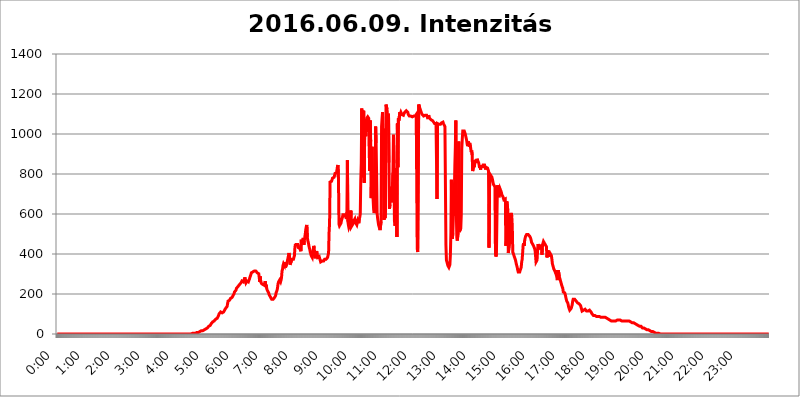
| Category | 2016.06.09. Intenzitás [W/m^2] |
|---|---|
| 0.0 | 0 |
| 0.0006944444444444445 | 0 |
| 0.001388888888888889 | 0 |
| 0.0020833333333333333 | 0 |
| 0.002777777777777778 | 0 |
| 0.003472222222222222 | 0 |
| 0.004166666666666667 | 0 |
| 0.004861111111111111 | 0 |
| 0.005555555555555556 | 0 |
| 0.0062499999999999995 | 0 |
| 0.006944444444444444 | 0 |
| 0.007638888888888889 | 0 |
| 0.008333333333333333 | 0 |
| 0.009027777777777779 | 0 |
| 0.009722222222222222 | 0 |
| 0.010416666666666666 | 0 |
| 0.011111111111111112 | 0 |
| 0.011805555555555555 | 0 |
| 0.012499999999999999 | 0 |
| 0.013194444444444444 | 0 |
| 0.013888888888888888 | 0 |
| 0.014583333333333332 | 0 |
| 0.015277777777777777 | 0 |
| 0.015972222222222224 | 0 |
| 0.016666666666666666 | 0 |
| 0.017361111111111112 | 0 |
| 0.018055555555555557 | 0 |
| 0.01875 | 0 |
| 0.019444444444444445 | 0 |
| 0.02013888888888889 | 0 |
| 0.020833333333333332 | 0 |
| 0.02152777777777778 | 0 |
| 0.022222222222222223 | 0 |
| 0.02291666666666667 | 0 |
| 0.02361111111111111 | 0 |
| 0.024305555555555556 | 0 |
| 0.024999999999999998 | 0 |
| 0.025694444444444447 | 0 |
| 0.02638888888888889 | 0 |
| 0.027083333333333334 | 0 |
| 0.027777777777777776 | 0 |
| 0.02847222222222222 | 0 |
| 0.029166666666666664 | 0 |
| 0.029861111111111113 | 0 |
| 0.030555555555555555 | 0 |
| 0.03125 | 0 |
| 0.03194444444444445 | 0 |
| 0.03263888888888889 | 0 |
| 0.03333333333333333 | 0 |
| 0.034027777777777775 | 0 |
| 0.034722222222222224 | 0 |
| 0.035416666666666666 | 0 |
| 0.036111111111111115 | 0 |
| 0.03680555555555556 | 0 |
| 0.0375 | 0 |
| 0.03819444444444444 | 0 |
| 0.03888888888888889 | 0 |
| 0.03958333333333333 | 0 |
| 0.04027777777777778 | 0 |
| 0.04097222222222222 | 0 |
| 0.041666666666666664 | 0 |
| 0.042361111111111106 | 0 |
| 0.04305555555555556 | 0 |
| 0.043750000000000004 | 0 |
| 0.044444444444444446 | 0 |
| 0.04513888888888889 | 0 |
| 0.04583333333333334 | 0 |
| 0.04652777777777778 | 0 |
| 0.04722222222222222 | 0 |
| 0.04791666666666666 | 0 |
| 0.04861111111111111 | 0 |
| 0.049305555555555554 | 0 |
| 0.049999999999999996 | 0 |
| 0.05069444444444445 | 0 |
| 0.051388888888888894 | 0 |
| 0.052083333333333336 | 0 |
| 0.05277777777777778 | 0 |
| 0.05347222222222222 | 0 |
| 0.05416666666666667 | 0 |
| 0.05486111111111111 | 0 |
| 0.05555555555555555 | 0 |
| 0.05625 | 0 |
| 0.05694444444444444 | 0 |
| 0.057638888888888885 | 0 |
| 0.05833333333333333 | 0 |
| 0.05902777777777778 | 0 |
| 0.059722222222222225 | 0 |
| 0.06041666666666667 | 0 |
| 0.061111111111111116 | 0 |
| 0.06180555555555556 | 0 |
| 0.0625 | 0 |
| 0.06319444444444444 | 0 |
| 0.06388888888888888 | 0 |
| 0.06458333333333334 | 0 |
| 0.06527777777777778 | 0 |
| 0.06597222222222222 | 0 |
| 0.06666666666666667 | 0 |
| 0.06736111111111111 | 0 |
| 0.06805555555555555 | 0 |
| 0.06874999999999999 | 0 |
| 0.06944444444444443 | 0 |
| 0.07013888888888889 | 0 |
| 0.07083333333333333 | 0 |
| 0.07152777777777779 | 0 |
| 0.07222222222222223 | 0 |
| 0.07291666666666667 | 0 |
| 0.07361111111111111 | 0 |
| 0.07430555555555556 | 0 |
| 0.075 | 0 |
| 0.07569444444444444 | 0 |
| 0.0763888888888889 | 0 |
| 0.07708333333333334 | 0 |
| 0.07777777777777778 | 0 |
| 0.07847222222222222 | 0 |
| 0.07916666666666666 | 0 |
| 0.0798611111111111 | 0 |
| 0.08055555555555556 | 0 |
| 0.08125 | 0 |
| 0.08194444444444444 | 0 |
| 0.08263888888888889 | 0 |
| 0.08333333333333333 | 0 |
| 0.08402777777777777 | 0 |
| 0.08472222222222221 | 0 |
| 0.08541666666666665 | 0 |
| 0.08611111111111112 | 0 |
| 0.08680555555555557 | 0 |
| 0.08750000000000001 | 0 |
| 0.08819444444444445 | 0 |
| 0.08888888888888889 | 0 |
| 0.08958333333333333 | 0 |
| 0.09027777777777778 | 0 |
| 0.09097222222222222 | 0 |
| 0.09166666666666667 | 0 |
| 0.09236111111111112 | 0 |
| 0.09305555555555556 | 0 |
| 0.09375 | 0 |
| 0.09444444444444444 | 0 |
| 0.09513888888888888 | 0 |
| 0.09583333333333333 | 0 |
| 0.09652777777777777 | 0 |
| 0.09722222222222222 | 0 |
| 0.09791666666666667 | 0 |
| 0.09861111111111111 | 0 |
| 0.09930555555555555 | 0 |
| 0.09999999999999999 | 0 |
| 0.10069444444444443 | 0 |
| 0.1013888888888889 | 0 |
| 0.10208333333333335 | 0 |
| 0.10277777777777779 | 0 |
| 0.10347222222222223 | 0 |
| 0.10416666666666667 | 0 |
| 0.10486111111111111 | 0 |
| 0.10555555555555556 | 0 |
| 0.10625 | 0 |
| 0.10694444444444444 | 0 |
| 0.1076388888888889 | 0 |
| 0.10833333333333334 | 0 |
| 0.10902777777777778 | 0 |
| 0.10972222222222222 | 0 |
| 0.1111111111111111 | 0 |
| 0.11180555555555556 | 0 |
| 0.11180555555555556 | 0 |
| 0.1125 | 0 |
| 0.11319444444444444 | 0 |
| 0.11388888888888889 | 0 |
| 0.11458333333333333 | 0 |
| 0.11527777777777777 | 0 |
| 0.11597222222222221 | 0 |
| 0.11666666666666665 | 0 |
| 0.1173611111111111 | 0 |
| 0.11805555555555557 | 0 |
| 0.11944444444444445 | 0 |
| 0.12013888888888889 | 0 |
| 0.12083333333333333 | 0 |
| 0.12152777777777778 | 0 |
| 0.12222222222222223 | 0 |
| 0.12291666666666667 | 0 |
| 0.12291666666666667 | 0 |
| 0.12361111111111112 | 0 |
| 0.12430555555555556 | 0 |
| 0.125 | 0 |
| 0.12569444444444444 | 0 |
| 0.12638888888888888 | 0 |
| 0.12708333333333333 | 0 |
| 0.16875 | 0 |
| 0.12847222222222224 | 0 |
| 0.12916666666666668 | 0 |
| 0.12986111111111112 | 0 |
| 0.13055555555555556 | 0 |
| 0.13125 | 0 |
| 0.13194444444444445 | 0 |
| 0.1326388888888889 | 0 |
| 0.13333333333333333 | 0 |
| 0.13402777777777777 | 0 |
| 0.13402777777777777 | 0 |
| 0.13472222222222222 | 0 |
| 0.13541666666666666 | 0 |
| 0.1361111111111111 | 0 |
| 0.13749999999999998 | 0 |
| 0.13819444444444443 | 0 |
| 0.1388888888888889 | 0 |
| 0.13958333333333334 | 0 |
| 0.14027777777777778 | 0 |
| 0.14097222222222222 | 0 |
| 0.14166666666666666 | 0 |
| 0.1423611111111111 | 0 |
| 0.14305555555555557 | 0 |
| 0.14375000000000002 | 0 |
| 0.14444444444444446 | 0 |
| 0.1451388888888889 | 0 |
| 0.1451388888888889 | 0 |
| 0.14652777777777778 | 0 |
| 0.14722222222222223 | 0 |
| 0.14791666666666667 | 0 |
| 0.1486111111111111 | 0 |
| 0.14930555555555555 | 0 |
| 0.15 | 0 |
| 0.15069444444444444 | 0 |
| 0.15138888888888888 | 0 |
| 0.15208333333333332 | 0 |
| 0.15277777777777776 | 0 |
| 0.15347222222222223 | 0 |
| 0.15416666666666667 | 0 |
| 0.15486111111111112 | 0 |
| 0.15555555555555556 | 0 |
| 0.15625 | 0 |
| 0.15694444444444444 | 0 |
| 0.15763888888888888 | 0 |
| 0.15833333333333333 | 0 |
| 0.15902777777777777 | 0 |
| 0.15972222222222224 | 0 |
| 0.16041666666666668 | 0 |
| 0.16111111111111112 | 0 |
| 0.16180555555555556 | 0 |
| 0.1625 | 0 |
| 0.16319444444444445 | 0 |
| 0.1638888888888889 | 0 |
| 0.16458333333333333 | 0 |
| 0.16527777777777777 | 0 |
| 0.16597222222222222 | 0 |
| 0.16666666666666666 | 0 |
| 0.1673611111111111 | 0 |
| 0.16805555555555554 | 0 |
| 0.16874999999999998 | 0 |
| 0.16944444444444443 | 0 |
| 0.17013888888888887 | 0 |
| 0.1708333333333333 | 0 |
| 0.17152777777777775 | 0 |
| 0.17222222222222225 | 0 |
| 0.1729166666666667 | 0 |
| 0.17361111111111113 | 0 |
| 0.17430555555555557 | 0 |
| 0.17500000000000002 | 0 |
| 0.17569444444444446 | 0 |
| 0.1763888888888889 | 0 |
| 0.17708333333333334 | 0 |
| 0.17777777777777778 | 0 |
| 0.17847222222222223 | 0 |
| 0.17916666666666667 | 0 |
| 0.1798611111111111 | 0 |
| 0.18055555555555555 | 0 |
| 0.18125 | 0 |
| 0.18194444444444444 | 0 |
| 0.1826388888888889 | 0 |
| 0.18333333333333335 | 0 |
| 0.1840277777777778 | 0 |
| 0.18472222222222223 | 0 |
| 0.18541666666666667 | 0 |
| 0.18611111111111112 | 0 |
| 0.18680555555555556 | 3.525 |
| 0.1875 | 0 |
| 0.18819444444444444 | 0 |
| 0.18888888888888888 | 3.525 |
| 0.18958333333333333 | 3.525 |
| 0.19027777777777777 | 3.525 |
| 0.1909722222222222 | 3.525 |
| 0.19166666666666665 | 3.525 |
| 0.19236111111111112 | 3.525 |
| 0.19305555555555554 | 3.525 |
| 0.19375 | 3.525 |
| 0.19444444444444445 | 3.525 |
| 0.1951388888888889 | 3.525 |
| 0.19583333333333333 | 7.887 |
| 0.19652777777777777 | 7.887 |
| 0.19722222222222222 | 7.887 |
| 0.19791666666666666 | 7.887 |
| 0.1986111111111111 | 12.257 |
| 0.19930555555555554 | 12.257 |
| 0.19999999999999998 | 12.257 |
| 0.20069444444444443 | 12.257 |
| 0.20138888888888887 | 12.257 |
| 0.2020833333333333 | 16.636 |
| 0.2027777777777778 | 16.636 |
| 0.2034722222222222 | 16.636 |
| 0.2041666666666667 | 16.636 |
| 0.20486111111111113 | 16.636 |
| 0.20555555555555557 | 21.024 |
| 0.20625000000000002 | 21.024 |
| 0.20694444444444446 | 21.024 |
| 0.2076388888888889 | 25.419 |
| 0.20833333333333334 | 25.419 |
| 0.20902777777777778 | 25.419 |
| 0.20972222222222223 | 29.823 |
| 0.21041666666666667 | 29.823 |
| 0.2111111111111111 | 29.823 |
| 0.21180555555555555 | 34.234 |
| 0.2125 | 38.653 |
| 0.21319444444444444 | 38.653 |
| 0.2138888888888889 | 43.079 |
| 0.21458333333333335 | 43.079 |
| 0.2152777777777778 | 47.511 |
| 0.21597222222222223 | 51.951 |
| 0.21666666666666667 | 56.398 |
| 0.21736111111111112 | 56.398 |
| 0.21805555555555556 | 60.85 |
| 0.21875 | 60.85 |
| 0.21944444444444444 | 65.31 |
| 0.22013888888888888 | 65.31 |
| 0.22083333333333333 | 69.775 |
| 0.22152777777777777 | 69.775 |
| 0.2222222222222222 | 74.246 |
| 0.22291666666666665 | 74.246 |
| 0.2236111111111111 | 78.722 |
| 0.22430555555555556 | 78.722 |
| 0.225 | 83.205 |
| 0.22569444444444445 | 87.692 |
| 0.2263888888888889 | 92.184 |
| 0.22708333333333333 | 101.184 |
| 0.22777777777777777 | 101.184 |
| 0.22847222222222222 | 105.69 |
| 0.22916666666666666 | 110.201 |
| 0.2298611111111111 | 110.201 |
| 0.23055555555555554 | 105.69 |
| 0.23124999999999998 | 105.69 |
| 0.23194444444444443 | 105.69 |
| 0.23263888888888887 | 105.69 |
| 0.2333333333333333 | 110.201 |
| 0.2340277777777778 | 110.201 |
| 0.2347222222222222 | 119.235 |
| 0.2354166666666667 | 123.758 |
| 0.23611111111111113 | 128.284 |
| 0.23680555555555557 | 132.814 |
| 0.23750000000000002 | 132.814 |
| 0.23819444444444446 | 137.347 |
| 0.2388888888888889 | 141.884 |
| 0.23958333333333334 | 164.605 |
| 0.24027777777777778 | 169.156 |
| 0.24097222222222223 | 169.156 |
| 0.24166666666666667 | 169.156 |
| 0.2423611111111111 | 173.709 |
| 0.24305555555555555 | 178.264 |
| 0.24375 | 178.264 |
| 0.24444444444444446 | 182.82 |
| 0.24513888888888888 | 182.82 |
| 0.24583333333333335 | 187.378 |
| 0.2465277777777778 | 191.937 |
| 0.24722222222222223 | 191.937 |
| 0.24791666666666667 | 201.058 |
| 0.24861111111111112 | 210.182 |
| 0.24930555555555556 | 214.746 |
| 0.25 | 214.746 |
| 0.25069444444444444 | 219.309 |
| 0.2513888888888889 | 228.436 |
| 0.2520833333333333 | 233 |
| 0.25277777777777777 | 233 |
| 0.2534722222222222 | 237.564 |
| 0.25416666666666665 | 242.127 |
| 0.2548611111111111 | 242.127 |
| 0.2555555555555556 | 246.689 |
| 0.25625000000000003 | 251.251 |
| 0.2569444444444445 | 251.251 |
| 0.2576388888888889 | 255.813 |
| 0.25833333333333336 | 260.373 |
| 0.2590277777777778 | 264.932 |
| 0.25972222222222224 | 264.932 |
| 0.2604166666666667 | 260.373 |
| 0.2611111111111111 | 260.373 |
| 0.26180555555555557 | 260.373 |
| 0.2625 | 255.813 |
| 0.26319444444444445 | 283.156 |
| 0.2638888888888889 | 264.932 |
| 0.26458333333333334 | 255.813 |
| 0.2652777777777778 | 255.813 |
| 0.2659722222222222 | 264.932 |
| 0.26666666666666666 | 260.373 |
| 0.2673611111111111 | 260.373 |
| 0.26805555555555555 | 260.373 |
| 0.26875 | 264.932 |
| 0.26944444444444443 | 274.047 |
| 0.2701388888888889 | 269.49 |
| 0.2708333333333333 | 269.49 |
| 0.27152777777777776 | 296.808 |
| 0.2722222222222222 | 305.898 |
| 0.27291666666666664 | 301.354 |
| 0.2736111111111111 | 305.898 |
| 0.2743055555555555 | 310.44 |
| 0.27499999999999997 | 314.98 |
| 0.27569444444444446 | 314.98 |
| 0.27638888888888885 | 314.98 |
| 0.27708333333333335 | 314.98 |
| 0.2777777777777778 | 314.98 |
| 0.27847222222222223 | 314.98 |
| 0.2791666666666667 | 314.98 |
| 0.2798611111111111 | 310.44 |
| 0.28055555555555556 | 305.898 |
| 0.28125 | 301.354 |
| 0.28194444444444444 | 301.354 |
| 0.2826388888888889 | 301.354 |
| 0.2833333333333333 | 296.808 |
| 0.28402777777777777 | 260.373 |
| 0.2847222222222222 | 287.709 |
| 0.28541666666666665 | 260.373 |
| 0.28611111111111115 | 260.373 |
| 0.28680555555555554 | 251.251 |
| 0.28750000000000003 | 251.251 |
| 0.2881944444444445 | 251.251 |
| 0.2888888888888889 | 246.689 |
| 0.28958333333333336 | 242.127 |
| 0.2902777777777778 | 242.127 |
| 0.29097222222222224 | 242.127 |
| 0.2916666666666667 | 264.932 |
| 0.2923611111111111 | 237.564 |
| 0.29305555555555557 | 246.689 |
| 0.29375 | 228.436 |
| 0.29444444444444445 | 219.309 |
| 0.2951388888888889 | 219.309 |
| 0.29583333333333334 | 214.746 |
| 0.2965277777777778 | 205.62 |
| 0.2972222222222222 | 196.497 |
| 0.29791666666666666 | 191.937 |
| 0.2986111111111111 | 187.378 |
| 0.29930555555555555 | 182.82 |
| 0.3 | 182.82 |
| 0.30069444444444443 | 173.709 |
| 0.3013888888888889 | 173.709 |
| 0.3020833333333333 | 173.709 |
| 0.30277777777777776 | 173.709 |
| 0.3034722222222222 | 178.264 |
| 0.30416666666666664 | 178.264 |
| 0.3048611111111111 | 182.82 |
| 0.3055555555555555 | 187.378 |
| 0.30624999999999997 | 191.937 |
| 0.3069444444444444 | 205.62 |
| 0.3076388888888889 | 210.182 |
| 0.30833333333333335 | 219.309 |
| 0.3090277777777778 | 233 |
| 0.30972222222222223 | 251.251 |
| 0.3104166666666667 | 260.373 |
| 0.3111111111111111 | 260.373 |
| 0.31180555555555556 | 269.49 |
| 0.3125 | 269.49 |
| 0.31319444444444444 | 260.373 |
| 0.3138888888888889 | 269.49 |
| 0.3145833333333333 | 283.156 |
| 0.31527777777777777 | 314.98 |
| 0.3159722222222222 | 324.052 |
| 0.31666666666666665 | 342.162 |
| 0.31736111111111115 | 351.198 |
| 0.31805555555555554 | 355.712 |
| 0.31875000000000003 | 342.162 |
| 0.3194444444444445 | 360.221 |
| 0.3201388888888889 | 333.113 |
| 0.32083333333333336 | 337.639 |
| 0.3215277777777778 | 346.682 |
| 0.32222222222222224 | 355.712 |
| 0.3229166666666667 | 351.198 |
| 0.3236111111111111 | 360.221 |
| 0.32430555555555557 | 391.685 |
| 0.325 | 405.108 |
| 0.32569444444444445 | 387.202 |
| 0.3263888888888889 | 346.682 |
| 0.32708333333333334 | 342.162 |
| 0.3277777777777778 | 351.198 |
| 0.3284722222222222 | 364.728 |
| 0.32916666666666666 | 373.729 |
| 0.3298611111111111 | 378.224 |
| 0.33055555555555555 | 373.729 |
| 0.33125 | 373.729 |
| 0.33194444444444443 | 378.224 |
| 0.3326388888888889 | 391.685 |
| 0.3333333333333333 | 431.833 |
| 0.3340277777777778 | 449.551 |
| 0.3347222222222222 | 440.702 |
| 0.3354166666666667 | 453.968 |
| 0.3361111111111111 | 440.702 |
| 0.3368055555555556 | 453.968 |
| 0.33749999999999997 | 458.38 |
| 0.33819444444444446 | 431.833 |
| 0.33888888888888885 | 431.833 |
| 0.33958333333333335 | 431.833 |
| 0.34027777777777773 | 427.39 |
| 0.34097222222222223 | 422.943 |
| 0.3416666666666666 | 414.035 |
| 0.3423611111111111 | 471.582 |
| 0.3430555555555555 | 458.38 |
| 0.34375 | 458.38 |
| 0.3444444444444445 | 471.582 |
| 0.3451388888888889 | 480.356 |
| 0.3458333333333334 | 445.129 |
| 0.34652777777777777 | 467.187 |
| 0.34722222222222227 | 471.582 |
| 0.34791666666666665 | 502.192 |
| 0.34861111111111115 | 523.88 |
| 0.34930555555555554 | 536.82 |
| 0.35000000000000003 | 545.416 |
| 0.3506944444444444 | 484.735 |
| 0.3513888888888889 | 467.187 |
| 0.3520833333333333 | 458.38 |
| 0.3527777777777778 | 445.129 |
| 0.3534722222222222 | 431.833 |
| 0.3541666666666667 | 422.943 |
| 0.3548611111111111 | 409.574 |
| 0.35555555555555557 | 400.638 |
| 0.35625 | 391.685 |
| 0.35694444444444445 | 387.202 |
| 0.3576388888888889 | 382.715 |
| 0.35833333333333334 | 378.224 |
| 0.3590277777777778 | 382.715 |
| 0.3597222222222222 | 440.702 |
| 0.36041666666666666 | 431.833 |
| 0.3611111111111111 | 391.685 |
| 0.36180555555555555 | 378.224 |
| 0.3625 | 414.035 |
| 0.36319444444444443 | 405.108 |
| 0.3638888888888889 | 414.035 |
| 0.3645833333333333 | 396.164 |
| 0.3652777777777778 | 382.715 |
| 0.3659722222222222 | 387.202 |
| 0.3666666666666667 | 387.202 |
| 0.3673611111111111 | 387.202 |
| 0.3680555555555556 | 378.224 |
| 0.36874999999999997 | 369.23 |
| 0.36944444444444446 | 360.221 |
| 0.37013888888888885 | 360.221 |
| 0.37083333333333335 | 364.728 |
| 0.37152777777777773 | 364.728 |
| 0.37222222222222223 | 369.23 |
| 0.3729166666666666 | 364.728 |
| 0.3736111111111111 | 364.728 |
| 0.3743055555555555 | 369.23 |
| 0.375 | 373.729 |
| 0.3756944444444445 | 373.729 |
| 0.3763888888888889 | 369.23 |
| 0.3770833333333334 | 373.729 |
| 0.37777777777777777 | 369.23 |
| 0.37847222222222227 | 373.729 |
| 0.37916666666666665 | 382.715 |
| 0.37986111111111115 | 387.202 |
| 0.38055555555555554 | 405.108 |
| 0.38125000000000003 | 506.542 |
| 0.3819444444444444 | 553.986 |
| 0.3826388888888889 | 759.723 |
| 0.3833333333333333 | 759.723 |
| 0.3840277777777778 | 759.723 |
| 0.3847222222222222 | 763.674 |
| 0.3854166666666667 | 771.559 |
| 0.3861111111111111 | 779.42 |
| 0.38680555555555557 | 783.342 |
| 0.3875 | 779.42 |
| 0.38819444444444445 | 783.342 |
| 0.3888888888888889 | 791.169 |
| 0.38958333333333334 | 802.868 |
| 0.3902777777777778 | 802.868 |
| 0.3909722222222222 | 806.757 |
| 0.39166666666666666 | 806.757 |
| 0.3923611111111111 | 822.26 |
| 0.39305555555555555 | 837.682 |
| 0.39375 | 845.365 |
| 0.39444444444444443 | 767.62 |
| 0.3951388888888889 | 549.704 |
| 0.3958333333333333 | 541.121 |
| 0.3965277777777778 | 541.121 |
| 0.3972222222222222 | 541.121 |
| 0.3979166666666667 | 553.986 |
| 0.3986111111111111 | 566.793 |
| 0.3993055555555556 | 575.299 |
| 0.39999999999999997 | 583.779 |
| 0.40069444444444446 | 596.45 |
| 0.40138888888888885 | 600.661 |
| 0.40208333333333335 | 600.661 |
| 0.40277777777777773 | 596.45 |
| 0.40347222222222223 | 596.45 |
| 0.4041666666666666 | 592.233 |
| 0.4048611111111111 | 583.779 |
| 0.4055555555555555 | 575.299 |
| 0.40625 | 609.062 |
| 0.4069444444444445 | 868.305 |
| 0.4076388888888889 | 562.53 |
| 0.4083333333333334 | 545.416 |
| 0.40902777777777777 | 532.513 |
| 0.40972222222222227 | 532.513 |
| 0.41041666666666665 | 545.416 |
| 0.41111111111111115 | 558.261 |
| 0.41180555555555554 | 617.436 |
| 0.41250000000000003 | 536.82 |
| 0.4131944444444444 | 536.82 |
| 0.4138888888888889 | 541.121 |
| 0.4145833333333333 | 549.704 |
| 0.4152777777777778 | 553.986 |
| 0.4159722222222222 | 566.793 |
| 0.4166666666666667 | 571.049 |
| 0.4173611111111111 | 575.299 |
| 0.41805555555555557 | 562.53 |
| 0.41875 | 553.986 |
| 0.41944444444444445 | 549.704 |
| 0.4201388888888889 | 545.416 |
| 0.42083333333333334 | 541.121 |
| 0.4215277777777778 | 566.793 |
| 0.4222222222222222 | 566.793 |
| 0.42291666666666666 | 553.986 |
| 0.4236111111111111 | 575.299 |
| 0.42430555555555555 | 583.779 |
| 0.425 | 600.661 |
| 0.42569444444444443 | 767.62 |
| 0.4263888888888889 | 853.029 |
| 0.4270833333333333 | 1127.879 |
| 0.4277777777777778 | 783.342 |
| 0.4284722222222222 | 1116.426 |
| 0.4291666666666667 | 1108.816 |
| 0.4298611111111111 | 1116.426 |
| 0.4305555555555556 | 755.766 |
| 0.43124999999999997 | 1052.255 |
| 0.43194444444444446 | 1018.587 |
| 0.43263888888888885 | 988.714 |
| 0.43333333333333335 | 1056.004 |
| 0.43402777777777773 | 1078.555 |
| 0.43472222222222223 | 1082.324 |
| 0.4354166666666666 | 1086.097 |
| 0.4361111111111111 | 1086.097 |
| 0.4368055555555555 | 1078.555 |
| 0.4375 | 921.298 |
| 0.4381944444444445 | 814.519 |
| 0.4388888888888889 | 1067.267 |
| 0.4395833333333334 | 962.555 |
| 0.44027777777777777 | 679.395 |
| 0.44097222222222227 | 806.757 |
| 0.44166666666666665 | 936.33 |
| 0.44236111111111115 | 719.877 |
| 0.44305555555555554 | 723.889 |
| 0.44375000000000003 | 621.613 |
| 0.4444444444444444 | 604.864 |
| 0.4451388888888889 | 613.252 |
| 0.4458333333333333 | 650.667 |
| 0.4465277777777778 | 1037.277 |
| 0.4472222222222222 | 955.071 |
| 0.4479166666666667 | 798.974 |
| 0.4486111111111111 | 604.864 |
| 0.44930555555555557 | 579.542 |
| 0.45 | 562.53 |
| 0.45069444444444445 | 545.416 |
| 0.4513888888888889 | 536.82 |
| 0.45208333333333334 | 528.2 |
| 0.4527777777777778 | 519.555 |
| 0.4534722222222222 | 523.88 |
| 0.45416666666666666 | 562.53 |
| 0.4548611111111111 | 1037.277 |
| 0.45555555555555555 | 1078.555 |
| 0.45625 | 1108.816 |
| 0.45694444444444443 | 860.676 |
| 0.4576388888888889 | 1026.06 |
| 0.4583333333333333 | 571.049 |
| 0.4590277777777778 | 604.864 |
| 0.4597222222222222 | 579.542 |
| 0.4604166666666667 | 621.613 |
| 0.4611111111111111 | 1147.086 |
| 0.4618055555555556 | 1147.086 |
| 0.46249999999999997 | 1124.056 |
| 0.46319444444444446 | 1093.653 |
| 0.46388888888888885 | 1059.756 |
| 0.46458333333333335 | 1101.226 |
| 0.46527777777777773 | 856.855 |
| 0.46597222222222223 | 625.784 |
| 0.4666666666666666 | 646.537 |
| 0.4673611111111111 | 687.544 |
| 0.4680555555555555 | 723.889 |
| 0.46875 | 735.89 |
| 0.4694444444444445 | 658.909 |
| 0.4701388888888889 | 658.909 |
| 0.4708333333333334 | 806.757 |
| 0.47152777777777777 | 996.182 |
| 0.47222222222222227 | 853.029 |
| 0.47291666666666665 | 566.793 |
| 0.47361111111111115 | 541.121 |
| 0.47430555555555554 | 549.704 |
| 0.47500000000000003 | 600.661 |
| 0.4756944444444444 | 829.981 |
| 0.4763888888888889 | 484.735 |
| 0.4770833333333333 | 1052.255 |
| 0.4777777777777778 | 833.834 |
| 0.4784722222222222 | 1078.555 |
| 0.4791666666666667 | 1067.267 |
| 0.4798611111111111 | 1067.267 |
| 0.48055555555555557 | 1108.816 |
| 0.48125 | 1101.226 |
| 0.48194444444444445 | 1108.816 |
| 0.4826388888888889 | 1105.019 |
| 0.48333333333333334 | 1097.437 |
| 0.4840277777777778 | 1093.653 |
| 0.4847222222222222 | 1093.653 |
| 0.48541666666666666 | 1093.653 |
| 0.4861111111111111 | 1101.226 |
| 0.48680555555555555 | 1105.019 |
| 0.4875 | 1108.816 |
| 0.48819444444444443 | 1112.618 |
| 0.4888888888888889 | 1108.816 |
| 0.4895833333333333 | 1116.426 |
| 0.4902777777777778 | 1116.426 |
| 0.4909722222222222 | 1116.426 |
| 0.4916666666666667 | 1108.816 |
| 0.4923611111111111 | 1097.437 |
| 0.4930555555555556 | 1097.437 |
| 0.49374999999999997 | 1089.873 |
| 0.49444444444444446 | 1089.873 |
| 0.49513888888888885 | 1089.873 |
| 0.49583333333333335 | 1089.873 |
| 0.49652777777777773 | 1086.097 |
| 0.49722222222222223 | 1086.097 |
| 0.4979166666666666 | 1086.097 |
| 0.4986111111111111 | 1086.097 |
| 0.4993055555555555 | 1089.873 |
| 0.5 | 1089.873 |
| 0.5006944444444444 | 1086.097 |
| 0.5013888888888889 | 1086.097 |
| 0.5020833333333333 | 1089.873 |
| 0.5027777777777778 | 1093.653 |
| 0.5034722222222222 | 1097.437 |
| 0.5041666666666667 | 1101.226 |
| 0.5048611111111111 | 427.39 |
| 0.5055555555555555 | 409.574 |
| 0.50625 | 414.035 |
| 0.5069444444444444 | 1147.086 |
| 0.5076388888888889 | 1147.086 |
| 0.5083333333333333 | 1131.708 |
| 0.5090277777777777 | 1127.879 |
| 0.5097222222222222 | 1116.426 |
| 0.5104166666666666 | 1108.816 |
| 0.5111111111111112 | 1108.816 |
| 0.5118055555555555 | 1097.437 |
| 0.5125000000000001 | 1097.437 |
| 0.5131944444444444 | 1093.653 |
| 0.513888888888889 | 1089.873 |
| 0.5145833333333333 | 1093.653 |
| 0.5152777777777778 | 1089.873 |
| 0.5159722222222222 | 1093.653 |
| 0.5166666666666667 | 1093.653 |
| 0.517361111111111 | 1093.653 |
| 0.5180555555555556 | 1093.653 |
| 0.5187499999999999 | 1097.437 |
| 0.5194444444444445 | 1093.653 |
| 0.5201388888888888 | 1074.789 |
| 0.5208333333333334 | 1093.653 |
| 0.5215277777777778 | 1086.097 |
| 0.5222222222222223 | 1078.555 |
| 0.5229166666666667 | 1074.789 |
| 0.5236111111111111 | 1074.789 |
| 0.5243055555555556 | 1071.027 |
| 0.525 | 1071.027 |
| 0.5256944444444445 | 1074.789 |
| 0.5263888888888889 | 1067.267 |
| 0.5270833333333333 | 1063.51 |
| 0.5277777777777778 | 1059.756 |
| 0.5284722222222222 | 1056.004 |
| 0.5291666666666667 | 1052.255 |
| 0.5298611111111111 | 1048.508 |
| 0.5305555555555556 | 1052.255 |
| 0.53125 | 1052.255 |
| 0.5319444444444444 | 1048.508 |
| 0.5326388888888889 | 675.311 |
| 0.5333333333333333 | 1052.255 |
| 0.5340277777777778 | 1052.255 |
| 0.5347222222222222 | 1056.004 |
| 0.5354166666666667 | 1048.508 |
| 0.5361111111111111 | 1048.508 |
| 0.5368055555555555 | 1052.255 |
| 0.5375 | 1048.508 |
| 0.5381944444444444 | 1052.255 |
| 0.5388888888888889 | 1056.004 |
| 0.5395833333333333 | 1052.255 |
| 0.5402777777777777 | 1059.756 |
| 0.5409722222222222 | 1059.756 |
| 0.5416666666666666 | 1052.255 |
| 0.5423611111111112 | 1048.508 |
| 0.5430555555555555 | 1052.255 |
| 0.5437500000000001 | 1037.277 |
| 0.5444444444444444 | 1041.019 |
| 0.545138888888889 | 445.129 |
| 0.5458333333333333 | 369.23 |
| 0.5465277777777778 | 360.221 |
| 0.5472222222222222 | 351.198 |
| 0.5479166666666667 | 342.162 |
| 0.548611111111111 | 337.639 |
| 0.5493055555555556 | 333.113 |
| 0.5499999999999999 | 333.113 |
| 0.5506944444444445 | 346.682 |
| 0.5513888888888888 | 396.164 |
| 0.5520833333333334 | 506.542 |
| 0.5527777777777778 | 771.559 |
| 0.5534722222222223 | 489.108 |
| 0.5541666666666667 | 475.972 |
| 0.5548611111111111 | 506.542 |
| 0.5555555555555556 | 588.009 |
| 0.55625 | 604.864 |
| 0.5569444444444445 | 711.832 |
| 0.5576388888888889 | 841.526 |
| 0.5583333333333333 | 932.576 |
| 0.5590277777777778 | 1067.267 |
| 0.5597222222222222 | 609.062 |
| 0.5604166666666667 | 480.356 |
| 0.5611111111111111 | 467.187 |
| 0.5618055555555556 | 467.187 |
| 0.5625 | 519.555 |
| 0.5631944444444444 | 962.555 |
| 0.5638888888888889 | 510.885 |
| 0.5645833333333333 | 506.542 |
| 0.5652777777777778 | 506.542 |
| 0.5659722222222222 | 528.2 |
| 0.5666666666666667 | 596.45 |
| 0.5673611111111111 | 925.06 |
| 0.5680555555555555 | 973.772 |
| 0.56875 | 1014.852 |
| 0.5694444444444444 | 1014.852 |
| 0.5701388888888889 | 1014.852 |
| 0.5708333333333333 | 1014.852 |
| 0.5715277777777777 | 1014.852 |
| 0.5722222222222222 | 999.916 |
| 0.5729166666666666 | 999.916 |
| 0.5736111111111112 | 999.916 |
| 0.5743055555555555 | 966.295 |
| 0.5750000000000001 | 947.58 |
| 0.5756944444444444 | 940.082 |
| 0.576388888888889 | 962.555 |
| 0.5770833333333333 | 955.071 |
| 0.5777777777777778 | 936.33 |
| 0.5784722222222222 | 955.071 |
| 0.5791666666666667 | 955.071 |
| 0.579861111111111 | 928.819 |
| 0.5805555555555556 | 909.996 |
| 0.5812499999999999 | 917.534 |
| 0.5819444444444445 | 894.885 |
| 0.5826388888888888 | 814.519 |
| 0.5833333333333334 | 810.641 |
| 0.5840277777777778 | 841.526 |
| 0.5847222222222223 | 833.834 |
| 0.5854166666666667 | 868.305 |
| 0.5861111111111111 | 856.855 |
| 0.5868055555555556 | 864.493 |
| 0.5875 | 872.114 |
| 0.5881944444444445 | 856.855 |
| 0.5888888888888889 | 875.918 |
| 0.5895833333333333 | 868.305 |
| 0.5902777777777778 | 868.305 |
| 0.5909722222222222 | 856.855 |
| 0.5916666666666667 | 845.365 |
| 0.5923611111111111 | 829.981 |
| 0.5930555555555556 | 841.526 |
| 0.59375 | 822.26 |
| 0.5944444444444444 | 837.682 |
| 0.5951388888888889 | 837.682 |
| 0.5958333333333333 | 837.682 |
| 0.5965277777777778 | 837.682 |
| 0.5972222222222222 | 845.365 |
| 0.5979166666666667 | 841.526 |
| 0.5986111111111111 | 841.526 |
| 0.5993055555555555 | 845.365 |
| 0.6 | 845.365 |
| 0.6006944444444444 | 822.26 |
| 0.6013888888888889 | 833.834 |
| 0.6020833333333333 | 829.981 |
| 0.6027777777777777 | 829.981 |
| 0.6034722222222222 | 829.981 |
| 0.6041666666666666 | 833.834 |
| 0.6048611111111112 | 814.519 |
| 0.6055555555555555 | 431.833 |
| 0.6062500000000001 | 723.889 |
| 0.6069444444444444 | 783.342 |
| 0.607638888888889 | 795.074 |
| 0.6083333333333333 | 791.169 |
| 0.6090277777777778 | 791.169 |
| 0.6097222222222222 | 783.342 |
| 0.6104166666666667 | 779.42 |
| 0.611111111111111 | 759.723 |
| 0.6118055555555556 | 747.834 |
| 0.6124999999999999 | 743.859 |
| 0.6131944444444445 | 751.803 |
| 0.6138888888888888 | 735.89 |
| 0.6145833333333334 | 405.108 |
| 0.6152777777777778 | 387.202 |
| 0.6159722222222223 | 400.638 |
| 0.6166666666666667 | 583.779 |
| 0.6173611111111111 | 743.859 |
| 0.6180555555555556 | 743.859 |
| 0.61875 | 711.832 |
| 0.6194444444444445 | 683.473 |
| 0.6201388888888889 | 715.858 |
| 0.6208333333333333 | 727.896 |
| 0.6215277777777778 | 727.896 |
| 0.6222222222222222 | 723.889 |
| 0.6229166666666667 | 707.8 |
| 0.6236111111111111 | 695.666 |
| 0.6243055555555556 | 691.608 |
| 0.625 | 687.544 |
| 0.6256944444444444 | 679.395 |
| 0.6263888888888889 | 671.22 |
| 0.6270833333333333 | 675.311 |
| 0.6277777777777778 | 667.123 |
| 0.6284722222222222 | 675.311 |
| 0.6291666666666667 | 440.702 |
| 0.6298611111111111 | 462.786 |
| 0.6305555555555555 | 663.019 |
| 0.63125 | 658.909 |
| 0.6319444444444444 | 617.436 |
| 0.6326388888888889 | 405.108 |
| 0.6333333333333333 | 405.108 |
| 0.6340277777777777 | 409.574 |
| 0.6347222222222222 | 471.582 |
| 0.6354166666666666 | 604.864 |
| 0.6361111111111112 | 596.45 |
| 0.6368055555555555 | 604.864 |
| 0.6375000000000001 | 588.009 |
| 0.6381944444444444 | 541.121 |
| 0.638888888888889 | 409.574 |
| 0.6395833333333333 | 405.108 |
| 0.6402777777777778 | 396.164 |
| 0.6409722222222222 | 387.202 |
| 0.6416666666666667 | 382.715 |
| 0.642361111111111 | 373.729 |
| 0.6430555555555556 | 364.728 |
| 0.6437499999999999 | 351.198 |
| 0.6444444444444445 | 342.162 |
| 0.6451388888888888 | 333.113 |
| 0.6458333333333334 | 319.517 |
| 0.6465277777777778 | 310.44 |
| 0.6472222222222223 | 305.898 |
| 0.6479166666666667 | 305.898 |
| 0.6486111111111111 | 310.44 |
| 0.6493055555555556 | 310.44 |
| 0.65 | 314.98 |
| 0.6506944444444445 | 333.113 |
| 0.6513888888888889 | 360.221 |
| 0.6520833333333333 | 373.729 |
| 0.6527777777777778 | 409.574 |
| 0.6534722222222222 | 445.129 |
| 0.6541666666666667 | 453.968 |
| 0.6548611111111111 | 440.702 |
| 0.6555555555555556 | 467.187 |
| 0.65625 | 480.356 |
| 0.6569444444444444 | 489.108 |
| 0.6576388888888889 | 489.108 |
| 0.6583333333333333 | 497.836 |
| 0.6590277777777778 | 502.192 |
| 0.6597222222222222 | 502.192 |
| 0.6604166666666667 | 497.836 |
| 0.6611111111111111 | 497.836 |
| 0.6618055555555555 | 497.836 |
| 0.6625 | 489.108 |
| 0.6631944444444444 | 489.108 |
| 0.6638888888888889 | 480.356 |
| 0.6645833333333333 | 475.972 |
| 0.6652777777777777 | 458.38 |
| 0.6659722222222222 | 458.38 |
| 0.6666666666666666 | 449.551 |
| 0.6673611111111111 | 445.129 |
| 0.6680555555555556 | 440.702 |
| 0.6687500000000001 | 436.27 |
| 0.6694444444444444 | 427.39 |
| 0.6701388888888888 | 418.492 |
| 0.6708333333333334 | 391.685 |
| 0.6715277777777778 | 360.221 |
| 0.6722222222222222 | 364.728 |
| 0.6729166666666666 | 369.23 |
| 0.6736111111111112 | 409.574 |
| 0.6743055555555556 | 449.551 |
| 0.6749999999999999 | 453.968 |
| 0.6756944444444444 | 453.968 |
| 0.6763888888888889 | 422.943 |
| 0.6770833333333334 | 440.702 |
| 0.6777777777777777 | 440.702 |
| 0.6784722222222223 | 445.129 |
| 0.6791666666666667 | 440.702 |
| 0.6798611111111111 | 396.164 |
| 0.6805555555555555 | 445.129 |
| 0.68125 | 453.968 |
| 0.6819444444444445 | 462.786 |
| 0.6826388888888889 | 462.786 |
| 0.6833333333333332 | 453.968 |
| 0.6840277777777778 | 449.551 |
| 0.6847222222222222 | 445.129 |
| 0.6854166666666667 | 440.702 |
| 0.686111111111111 | 436.27 |
| 0.6868055555555556 | 382.715 |
| 0.6875 | 382.715 |
| 0.6881944444444444 | 418.492 |
| 0.688888888888889 | 387.202 |
| 0.6895833333333333 | 396.164 |
| 0.6902777777777778 | 400.638 |
| 0.6909722222222222 | 405.108 |
| 0.6916666666666668 | 409.574 |
| 0.6923611111111111 | 405.108 |
| 0.6930555555555555 | 391.685 |
| 0.69375 | 373.729 |
| 0.6944444444444445 | 351.198 |
| 0.6951388888888889 | 342.162 |
| 0.6958333333333333 | 333.113 |
| 0.6965277777777777 | 324.052 |
| 0.6972222222222223 | 319.517 |
| 0.6979166666666666 | 314.98 |
| 0.6986111111111111 | 310.44 |
| 0.6993055555555556 | 301.354 |
| 0.7000000000000001 | 305.898 |
| 0.7006944444444444 | 319.517 |
| 0.7013888888888888 | 269.49 |
| 0.7020833333333334 | 283.156 |
| 0.7027777777777778 | 319.517 |
| 0.7034722222222222 | 314.98 |
| 0.7041666666666666 | 287.709 |
| 0.7048611111111112 | 278.603 |
| 0.7055555555555556 | 269.49 |
| 0.7062499999999999 | 260.373 |
| 0.7069444444444444 | 251.251 |
| 0.7076388888888889 | 242.127 |
| 0.7083333333333334 | 242.127 |
| 0.7090277777777777 | 228.436 |
| 0.7097222222222223 | 210.182 |
| 0.7104166666666667 | 210.182 |
| 0.7111111111111111 | 210.182 |
| 0.7118055555555555 | 205.62 |
| 0.7125 | 196.497 |
| 0.7131944444444445 | 191.937 |
| 0.7138888888888889 | 173.709 |
| 0.7145833333333332 | 164.605 |
| 0.7152777777777778 | 160.056 |
| 0.7159722222222222 | 155.509 |
| 0.7166666666666667 | 146.423 |
| 0.717361111111111 | 132.814 |
| 0.7180555555555556 | 128.284 |
| 0.71875 | 119.235 |
| 0.7194444444444444 | 119.235 |
| 0.720138888888889 | 123.758 |
| 0.7208333333333333 | 128.284 |
| 0.7215277777777778 | 132.814 |
| 0.7222222222222222 | 146.423 |
| 0.7229166666666668 | 164.605 |
| 0.7236111111111111 | 173.709 |
| 0.7243055555555555 | 173.709 |
| 0.725 | 173.709 |
| 0.7256944444444445 | 173.709 |
| 0.7263888888888889 | 173.709 |
| 0.7270833333333333 | 169.156 |
| 0.7277777777777777 | 164.605 |
| 0.7284722222222223 | 160.056 |
| 0.7291666666666666 | 160.056 |
| 0.7298611111111111 | 155.509 |
| 0.7305555555555556 | 155.509 |
| 0.7312500000000001 | 150.964 |
| 0.7319444444444444 | 150.964 |
| 0.7326388888888888 | 146.423 |
| 0.7333333333333334 | 146.423 |
| 0.7340277777777778 | 141.884 |
| 0.7347222222222222 | 132.814 |
| 0.7354166666666666 | 123.758 |
| 0.7361111111111112 | 114.716 |
| 0.7368055555555556 | 114.716 |
| 0.7374999999999999 | 114.716 |
| 0.7381944444444444 | 119.235 |
| 0.7388888888888889 | 119.235 |
| 0.7395833333333334 | 119.235 |
| 0.7402777777777777 | 123.758 |
| 0.7409722222222223 | 119.235 |
| 0.7416666666666667 | 119.235 |
| 0.7423611111111111 | 114.716 |
| 0.7430555555555555 | 114.716 |
| 0.74375 | 114.716 |
| 0.7444444444444445 | 114.716 |
| 0.7451388888888889 | 114.716 |
| 0.7458333333333332 | 119.235 |
| 0.7465277777777778 | 119.235 |
| 0.7472222222222222 | 114.716 |
| 0.7479166666666667 | 114.716 |
| 0.748611111111111 | 110.201 |
| 0.7493055555555556 | 110.201 |
| 0.75 | 101.184 |
| 0.7506944444444444 | 101.184 |
| 0.751388888888889 | 96.682 |
| 0.7520833333333333 | 92.184 |
| 0.7527777777777778 | 92.184 |
| 0.7534722222222222 | 92.184 |
| 0.7541666666666668 | 92.184 |
| 0.7548611111111111 | 92.184 |
| 0.7555555555555555 | 87.692 |
| 0.75625 | 87.692 |
| 0.7569444444444445 | 87.692 |
| 0.7576388888888889 | 87.692 |
| 0.7583333333333333 | 87.692 |
| 0.7590277777777777 | 87.692 |
| 0.7597222222222223 | 87.692 |
| 0.7604166666666666 | 87.692 |
| 0.7611111111111111 | 87.692 |
| 0.7618055555555556 | 87.692 |
| 0.7625000000000001 | 83.205 |
| 0.7631944444444444 | 83.205 |
| 0.7638888888888888 | 83.205 |
| 0.7645833333333334 | 83.205 |
| 0.7652777777777778 | 83.205 |
| 0.7659722222222222 | 83.205 |
| 0.7666666666666666 | 83.205 |
| 0.7673611111111112 | 83.205 |
| 0.7680555555555556 | 83.205 |
| 0.7687499999999999 | 83.205 |
| 0.7694444444444444 | 83.205 |
| 0.7701388888888889 | 83.205 |
| 0.7708333333333334 | 78.722 |
| 0.7715277777777777 | 78.722 |
| 0.7722222222222223 | 74.246 |
| 0.7729166666666667 | 74.246 |
| 0.7736111111111111 | 74.246 |
| 0.7743055555555555 | 69.775 |
| 0.775 | 69.775 |
| 0.7756944444444445 | 69.775 |
| 0.7763888888888889 | 69.775 |
| 0.7770833333333332 | 65.31 |
| 0.7777777777777778 | 65.31 |
| 0.7784722222222222 | 65.31 |
| 0.7791666666666667 | 65.31 |
| 0.779861111111111 | 65.31 |
| 0.7805555555555556 | 65.31 |
| 0.78125 | 65.31 |
| 0.7819444444444444 | 65.31 |
| 0.782638888888889 | 65.31 |
| 0.7833333333333333 | 65.31 |
| 0.7840277777777778 | 69.775 |
| 0.7847222222222222 | 69.775 |
| 0.7854166666666668 | 69.775 |
| 0.7861111111111111 | 74.246 |
| 0.7868055555555555 | 74.246 |
| 0.7875 | 69.775 |
| 0.7881944444444445 | 69.775 |
| 0.7888888888888889 | 69.775 |
| 0.7895833333333333 | 69.775 |
| 0.7902777777777777 | 69.775 |
| 0.7909722222222223 | 65.31 |
| 0.7916666666666666 | 65.31 |
| 0.7923611111111111 | 65.31 |
| 0.7930555555555556 | 65.31 |
| 0.7937500000000001 | 65.31 |
| 0.7944444444444444 | 65.31 |
| 0.7951388888888888 | 65.31 |
| 0.7958333333333334 | 65.31 |
| 0.7965277777777778 | 65.31 |
| 0.7972222222222222 | 65.31 |
| 0.7979166666666666 | 65.31 |
| 0.7986111111111112 | 65.31 |
| 0.7993055555555556 | 65.31 |
| 0.7999999999999999 | 65.31 |
| 0.8006944444444444 | 65.31 |
| 0.8013888888888889 | 60.85 |
| 0.8020833333333334 | 65.31 |
| 0.8027777777777777 | 60.85 |
| 0.8034722222222223 | 60.85 |
| 0.8041666666666667 | 60.85 |
| 0.8048611111111111 | 60.85 |
| 0.8055555555555555 | 60.85 |
| 0.80625 | 56.398 |
| 0.8069444444444445 | 56.398 |
| 0.8076388888888889 | 56.398 |
| 0.8083333333333332 | 56.398 |
| 0.8090277777777778 | 56.398 |
| 0.8097222222222222 | 51.951 |
| 0.8104166666666667 | 51.951 |
| 0.811111111111111 | 51.951 |
| 0.8118055555555556 | 47.511 |
| 0.8125 | 47.511 |
| 0.8131944444444444 | 47.511 |
| 0.813888888888889 | 47.511 |
| 0.8145833333333333 | 43.079 |
| 0.8152777777777778 | 43.079 |
| 0.8159722222222222 | 43.079 |
| 0.8166666666666668 | 38.653 |
| 0.8173611111111111 | 38.653 |
| 0.8180555555555555 | 38.653 |
| 0.81875 | 38.653 |
| 0.8194444444444445 | 34.234 |
| 0.8201388888888889 | 34.234 |
| 0.8208333333333333 | 29.823 |
| 0.8215277777777777 | 29.823 |
| 0.8222222222222223 | 29.823 |
| 0.8229166666666666 | 29.823 |
| 0.8236111111111111 | 25.419 |
| 0.8243055555555556 | 25.419 |
| 0.8250000000000001 | 25.419 |
| 0.8256944444444444 | 21.024 |
| 0.8263888888888888 | 21.024 |
| 0.8270833333333334 | 21.024 |
| 0.8277777777777778 | 21.024 |
| 0.8284722222222222 | 21.024 |
| 0.8291666666666666 | 21.024 |
| 0.8298611111111112 | 16.636 |
| 0.8305555555555556 | 16.636 |
| 0.8312499999999999 | 16.636 |
| 0.8319444444444444 | 12.257 |
| 0.8326388888888889 | 12.257 |
| 0.8333333333333334 | 12.257 |
| 0.8340277777777777 | 12.257 |
| 0.8347222222222223 | 12.257 |
| 0.8354166666666667 | 12.257 |
| 0.8361111111111111 | 12.257 |
| 0.8368055555555555 | 7.887 |
| 0.8375 | 7.887 |
| 0.8381944444444445 | 7.887 |
| 0.8388888888888889 | 7.887 |
| 0.8395833333333332 | 3.525 |
| 0.8402777777777778 | 3.525 |
| 0.8409722222222222 | 3.525 |
| 0.8416666666666667 | 3.525 |
| 0.842361111111111 | 3.525 |
| 0.8430555555555556 | 3.525 |
| 0.84375 | 3.525 |
| 0.8444444444444444 | 3.525 |
| 0.845138888888889 | 3.525 |
| 0.8458333333333333 | 0 |
| 0.8465277777777778 | 0 |
| 0.8472222222222222 | 0 |
| 0.8479166666666668 | 0 |
| 0.8486111111111111 | 0 |
| 0.8493055555555555 | 0 |
| 0.85 | 0 |
| 0.8506944444444445 | 0 |
| 0.8513888888888889 | 0 |
| 0.8520833333333333 | 0 |
| 0.8527777777777777 | 0 |
| 0.8534722222222223 | 0 |
| 0.8541666666666666 | 0 |
| 0.8548611111111111 | 0 |
| 0.8555555555555556 | 0 |
| 0.8562500000000001 | 0 |
| 0.8569444444444444 | 0 |
| 0.8576388888888888 | 0 |
| 0.8583333333333334 | 0 |
| 0.8590277777777778 | 0 |
| 0.8597222222222222 | 0 |
| 0.8604166666666666 | 0 |
| 0.8611111111111112 | 0 |
| 0.8618055555555556 | 0 |
| 0.8624999999999999 | 0 |
| 0.8631944444444444 | 0 |
| 0.8638888888888889 | 0 |
| 0.8645833333333334 | 0 |
| 0.8652777777777777 | 0 |
| 0.8659722222222223 | 0 |
| 0.8666666666666667 | 0 |
| 0.8673611111111111 | 0 |
| 0.8680555555555555 | 0 |
| 0.86875 | 0 |
| 0.8694444444444445 | 0 |
| 0.8701388888888889 | 0 |
| 0.8708333333333332 | 0 |
| 0.8715277777777778 | 0 |
| 0.8722222222222222 | 0 |
| 0.8729166666666667 | 0 |
| 0.873611111111111 | 0 |
| 0.8743055555555556 | 0 |
| 0.875 | 0 |
| 0.8756944444444444 | 0 |
| 0.876388888888889 | 0 |
| 0.8770833333333333 | 0 |
| 0.8777777777777778 | 0 |
| 0.8784722222222222 | 0 |
| 0.8791666666666668 | 0 |
| 0.8798611111111111 | 0 |
| 0.8805555555555555 | 0 |
| 0.88125 | 0 |
| 0.8819444444444445 | 0 |
| 0.8826388888888889 | 0 |
| 0.8833333333333333 | 0 |
| 0.8840277777777777 | 0 |
| 0.8847222222222223 | 0 |
| 0.8854166666666666 | 0 |
| 0.8861111111111111 | 0 |
| 0.8868055555555556 | 0 |
| 0.8875000000000001 | 0 |
| 0.8881944444444444 | 0 |
| 0.8888888888888888 | 0 |
| 0.8895833333333334 | 0 |
| 0.8902777777777778 | 0 |
| 0.8909722222222222 | 0 |
| 0.8916666666666666 | 0 |
| 0.8923611111111112 | 0 |
| 0.8930555555555556 | 0 |
| 0.8937499999999999 | 0 |
| 0.8944444444444444 | 0 |
| 0.8951388888888889 | 0 |
| 0.8958333333333334 | 0 |
| 0.8965277777777777 | 0 |
| 0.8972222222222223 | 0 |
| 0.8979166666666667 | 0 |
| 0.8986111111111111 | 0 |
| 0.8993055555555555 | 0 |
| 0.9 | 0 |
| 0.9006944444444445 | 0 |
| 0.9013888888888889 | 0 |
| 0.9020833333333332 | 0 |
| 0.9027777777777778 | 0 |
| 0.9034722222222222 | 0 |
| 0.9041666666666667 | 0 |
| 0.904861111111111 | 0 |
| 0.9055555555555556 | 0 |
| 0.90625 | 0 |
| 0.9069444444444444 | 0 |
| 0.907638888888889 | 0 |
| 0.9083333333333333 | 0 |
| 0.9090277777777778 | 0 |
| 0.9097222222222222 | 0 |
| 0.9104166666666668 | 0 |
| 0.9111111111111111 | 0 |
| 0.9118055555555555 | 0 |
| 0.9125 | 0 |
| 0.9131944444444445 | 0 |
| 0.9138888888888889 | 0 |
| 0.9145833333333333 | 0 |
| 0.9152777777777777 | 0 |
| 0.9159722222222223 | 0 |
| 0.9166666666666666 | 0 |
| 0.9173611111111111 | 0 |
| 0.9180555555555556 | 0 |
| 0.9187500000000001 | 0 |
| 0.9194444444444444 | 0 |
| 0.9201388888888888 | 0 |
| 0.9208333333333334 | 0 |
| 0.9215277777777778 | 0 |
| 0.9222222222222222 | 0 |
| 0.9229166666666666 | 0 |
| 0.9236111111111112 | 0 |
| 0.9243055555555556 | 0 |
| 0.9249999999999999 | 0 |
| 0.9256944444444444 | 0 |
| 0.9263888888888889 | 0 |
| 0.9270833333333334 | 0 |
| 0.9277777777777777 | 0 |
| 0.9284722222222223 | 0 |
| 0.9291666666666667 | 0 |
| 0.9298611111111111 | 0 |
| 0.9305555555555555 | 0 |
| 0.93125 | 0 |
| 0.9319444444444445 | 0 |
| 0.9326388888888889 | 0 |
| 0.9333333333333332 | 0 |
| 0.9340277777777778 | 0 |
| 0.9347222222222222 | 0 |
| 0.9354166666666667 | 0 |
| 0.936111111111111 | 0 |
| 0.9368055555555556 | 0 |
| 0.9375 | 0 |
| 0.9381944444444444 | 0 |
| 0.938888888888889 | 0 |
| 0.9395833333333333 | 0 |
| 0.9402777777777778 | 0 |
| 0.9409722222222222 | 0 |
| 0.9416666666666668 | 0 |
| 0.9423611111111111 | 0 |
| 0.9430555555555555 | 0 |
| 0.94375 | 0 |
| 0.9444444444444445 | 0 |
| 0.9451388888888889 | 0 |
| 0.9458333333333333 | 0 |
| 0.9465277777777777 | 0 |
| 0.9472222222222223 | 0 |
| 0.9479166666666666 | 0 |
| 0.9486111111111111 | 0 |
| 0.9493055555555556 | 0 |
| 0.9500000000000001 | 0 |
| 0.9506944444444444 | 0 |
| 0.9513888888888888 | 0 |
| 0.9520833333333334 | 0 |
| 0.9527777777777778 | 0 |
| 0.9534722222222222 | 0 |
| 0.9541666666666666 | 0 |
| 0.9548611111111112 | 0 |
| 0.9555555555555556 | 0 |
| 0.9562499999999999 | 0 |
| 0.9569444444444444 | 0 |
| 0.9576388888888889 | 0 |
| 0.9583333333333334 | 0 |
| 0.9590277777777777 | 0 |
| 0.9597222222222223 | 0 |
| 0.9604166666666667 | 0 |
| 0.9611111111111111 | 0 |
| 0.9618055555555555 | 0 |
| 0.9625 | 0 |
| 0.9631944444444445 | 0 |
| 0.9638888888888889 | 0 |
| 0.9645833333333332 | 0 |
| 0.9652777777777778 | 0 |
| 0.9659722222222222 | 0 |
| 0.9666666666666667 | 0 |
| 0.967361111111111 | 0 |
| 0.9680555555555556 | 0 |
| 0.96875 | 0 |
| 0.9694444444444444 | 0 |
| 0.970138888888889 | 0 |
| 0.9708333333333333 | 0 |
| 0.9715277777777778 | 0 |
| 0.9722222222222222 | 0 |
| 0.9729166666666668 | 0 |
| 0.9736111111111111 | 0 |
| 0.9743055555555555 | 0 |
| 0.975 | 0 |
| 0.9756944444444445 | 0 |
| 0.9763888888888889 | 0 |
| 0.9770833333333333 | 0 |
| 0.9777777777777777 | 0 |
| 0.9784722222222223 | 0 |
| 0.9791666666666666 | 0 |
| 0.9798611111111111 | 0 |
| 0.9805555555555556 | 0 |
| 0.9812500000000001 | 0 |
| 0.9819444444444444 | 0 |
| 0.9826388888888888 | 0 |
| 0.9833333333333334 | 0 |
| 0.9840277777777778 | 0 |
| 0.9847222222222222 | 0 |
| 0.9854166666666666 | 0 |
| 0.9861111111111112 | 0 |
| 0.9868055555555556 | 0 |
| 0.9874999999999999 | 0 |
| 0.9881944444444444 | 0 |
| 0.9888888888888889 | 0 |
| 0.9895833333333334 | 0 |
| 0.9902777777777777 | 0 |
| 0.9909722222222223 | 0 |
| 0.9916666666666667 | 0 |
| 0.9923611111111111 | 0 |
| 0.9930555555555555 | 0 |
| 0.99375 | 0 |
| 0.9944444444444445 | 0 |
| 0.9951388888888889 | 0 |
| 0.9958333333333332 | 0 |
| 0.9965277777777778 | 0 |
| 0.9972222222222222 | 0 |
| 0.9979166666666667 | 0 |
| 0.998611111111111 | 0 |
| 0.9993055555555556 | 0 |